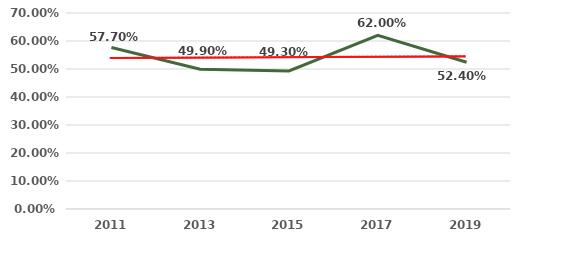
| Category | Series 0 |
|---|---|
| 2011.0 | 0.577 |
| 2013.0 | 0.499 |
| 2015.0 | 0.493 |
| 2017.0 | 0.62 |
| 2019.0 | 0.524 |